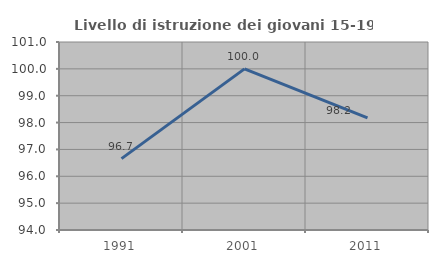
| Category | Livello di istruzione dei giovani 15-19 anni |
|---|---|
| 1991.0 | 96.657 |
| 2001.0 | 100 |
| 2011.0 | 98.174 |